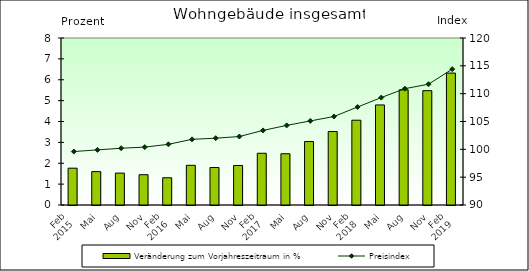
| Category | Veränderung zum Vorjahreszeitraum in % |
|---|---|
| 0 | 1.764 |
| 1 | 1.599 |
| 2 | 1.529 |
| 3 | 1.451 |
| 4 | 1.305 |
| 5 | 1.902 |
| 6 | 1.796 |
| 7 | 1.892 |
| 8 | 2.478 |
| 9 | 2.456 |
| 10 | 3.039 |
| 11 | 3.519 |
| 12 | 4.062 |
| 13 | 4.794 |
| 14 | 5.519 |
| 15 | 5.477 |
| 16 | 6.32 |